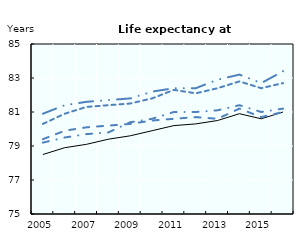
| Category | EU28 | Germany | France | Italy | United Kingdom |
|---|---|---|---|---|---|
| 2005.0 | 78.5 | 79.4 | 80.3 | 80.9 | 79.2 |
| 2006.0 | 78.9 | 79.9 | 80.9 | 81.4 | 79.5 |
| 2007.0 | 79.1 | 80.1 | 81.3 | 81.6 | 79.7 |
| 2008.0 | 79.4 | 80.2 | 81.4 | 81.7 | 79.8 |
| 2009.0 | 79.6 | 80.3 | 81.5 | 81.8 | 80.4 |
| 2010.0 | 79.9 | 80.5 | 81.8 | 82.2 | 80.6 |
| 2011.0 | 80.2 | 80.6 | 82.3 | 82.4 | 81 |
| 2012.0 | 80.3 | 80.7 | 82.1 | 82.4 | 81 |
| 2013.0 | 80.5 | 80.6 | 82.4 | 82.9 | 81.1 |
| 2014.0 | 80.9 | 81.2 | 82.8 | 83.2 | 81.4 |
| 2015.0 | 80.6 | 80.7 | 82.4 | 82.7 | 81 |
| 2016.0 | 81 | 81 | 82.7 | 83.4 | 81.2 |